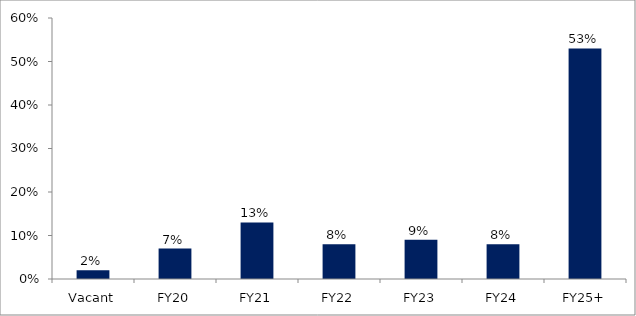
| Category | Series 0 |
|---|---|
| Vacant | 0.02 |
| FY20 | 0.07 |
| FY21 | 0.13 |
| FY22 | 0.08 |
| FY23 | 0.09 |
| FY24 | 0.08 |
| FY25+ | 0.53 |